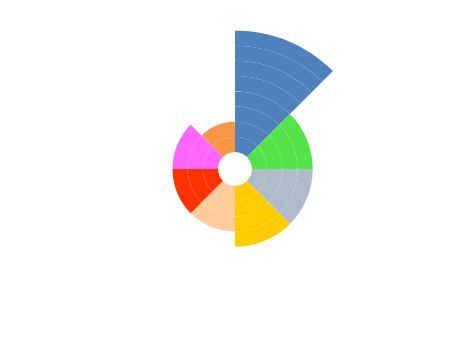
| Category | Series 0 | Series 1 | Series 2 | Series 3 | Series 4 | Series 5 | Series 6 | Series 7 | Series 8 | Series 9 |
|---|---|---|---|---|---|---|---|---|---|---|
| 10.0 | 10 | 10 | 10 | 10 | 10 | 10 | 10 | 10 | 0 | 0 |
| 0.0 | 0 | 0 | 0 | 0 | 0 | 0 | 0 | 0 | 10 | 10 |
| 10.0 | 10 | 10 | 10 | 10 | 0 | 0 | 0 | 0 | 0 | 0 |
| 0.0 | 0 | 0 | 0 | 0 | 10 | 10 | 10 | 10 | 10 | 10 |
| 10.0 | 10 | 10 | 10 | 10 | 0 | 0 | 0 | 0 | 0 | 0 |
| 0.0 | 0 | 0 | 0 | 0 | 10 | 10 | 10 | 10 | 10 | 10 |
| 10.0 | 10 | 10 | 10 | 10 | 0 | 0 | 0 | 0 | 0 | 0 |
| 0.0 | 0 | 0 | 0 | 0 | 10 | 10 | 10 | 10 | 10 | 10 |
| 10.0 | 10 | 10 | 10 | 0 | 0 | 0 | 0 | 0 | 0 | 0 |
| 0.0 | 0 | 0 | 0 | 10 | 10 | 10 | 10 | 10 | 10 | 10 |
| 10.0 | 10 | 10 | 10 | 0 | 0 | 0 | 0 | 0 | 0 | 0 |
| 0.0 | 0 | 0 | 0 | 10 | 10 | 10 | 10 | 10 | 10 | 10 |
| 10.0 | 10 | 10 | 10 | 0 | 0 | 0 | 0 | 0 | 0 | 0 |
| 0.0 | 0 | 0 | 0 | 10 | 10 | 10 | 10 | 10 | 10 | 10 |
| 0.0 | 10 | 10 | 0 | 0 | 0 | 0 | 0 | 0 | 0 | 0 |
| 10.0 | 0 | 0 | 10 | 10 | 10 | 10 | 10 | 10 | 10 | 10 |